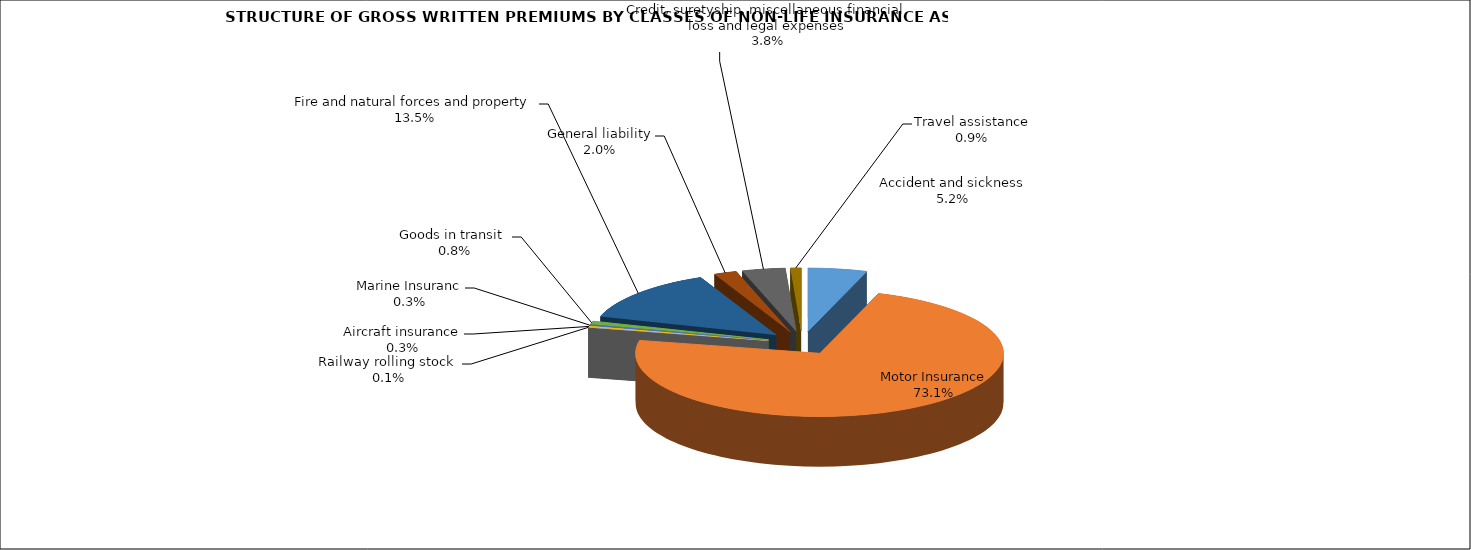
| Category | Accident and sickness |
|---|---|
| Accident and sickness | 0.052 |
| Motor Insurance | 0.731 |
| Railway rolling stock  | 0.001 |
| Aircraft insurance | 0.003 |
| Marine Insuranc | 0.003 |
| Goods in transit  | 0.008 |
| Fire and natural forces and property | 0.135 |
| General liability | 0.02 |
| Credit, suretyship, miscellaneous financial loss and legal expenses | 0.038 |
| Travel assistance | 0.009 |